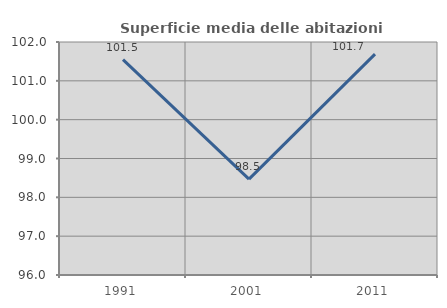
| Category | Superficie media delle abitazioni occupate |
|---|---|
| 1991.0 | 101.545 |
| 2001.0 | 98.468 |
| 2011.0 | 101.689 |